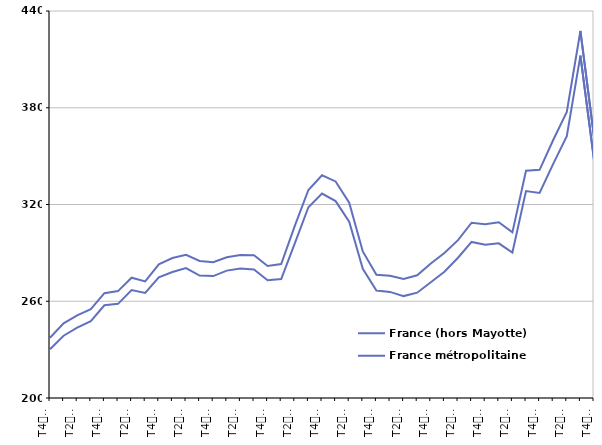
| Category | France (hors Mayotte) | France métropolitaine |
|---|---|---|
| T4
2011 | 237.4 | 230.2 |
| T1
2012 | 246.3 | 238.6 |
| T2
2012 | 251.2 | 243.7 |
| T3
2012 | 255.1 | 247.6 |
| T4
2012 | 265 | 257.5 |
| T1
2013 | 266.3 | 258.4 |
| T2
2013 | 274.6 | 266.9 |
| T3
2013 | 272.3 | 265.2 |
| T4
2013 | 282.9 | 274.8 |
| T1
2014 | 286.8 | 278.1 |
| T2
2014 | 288.8 | 280.6 |
| T3
2014 | 285 | 275.9 |
| T4
2014 | 284.2 | 275.6 |
| T1
2015 | 287.3 | 279 |
| T2
2015 | 288.7 | 280.3 |
| T3
2015 | 288.6 | 279.7 |
| T4
2015 | 281.9 | 273 |
| T1
2016 | 283.1 | 273.8 |
| T2
2016 | 306.7 | 295.9 |
| T3
2016 | 329 | 318.3 |
| T4
2016 | 338.1 | 326.8 |
| T1
2017 | 334.3 | 322.1 |
| T2
2017 | 321.1 | 309.3 |
| T3
2017 | 290.9 | 280.1 |
| T4
2017 | 276.4 | 266.6 |
| T1
2018 | 275.8 | 265.8 |
| T2
2018 | 273.8 | 263.2 |
| T3
2018 | 276.1 | 265.3 |
| T4
2018 | 283.4 | 271.8 |
| T1
2019 | 289.9 | 278.3 |
| T2
2019 | 297.9 | 287 |
| T3
2019 | 308.7 | 296.8 |
| T4
2019 | 307.8 | 295.1 |
| T1
2020 | 309 | 295.9 |
| T2
2020 | 302.7 | 290.2 |
| T3
2020 | 340.9 | 328.3 |
| T4
2020 | 341.5 | 327.2 |
| T1
2021 | 360 | 345.2 |
| T2
2021 | 377.4 | 362.3 |
| T3
2021 | 427.6 | 412.3 |
| T4
2021 | 361.9 | 347.8 |